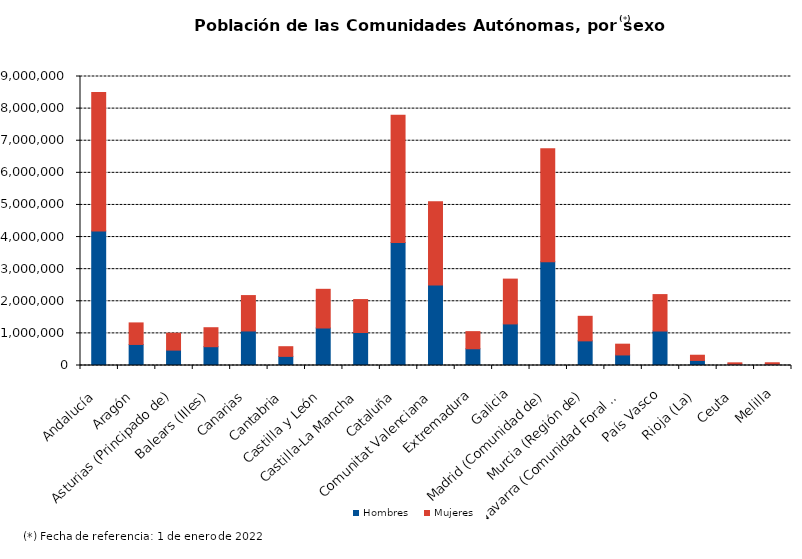
| Category | Hombres | Mujeres |
|---|---|---|
| Andalucía | 4187595 | 4312592 |
| Aragón | 655476 | 670839 |
| Asturias (Principado de) | 479134 | 525552 |
| Balears (IIles) | 585696 | 590963 |
| Canarias | 1075415 | 1102286 |
| Cantabria | 283718 | 301684 |
| Castilla y León | 1167883 | 1204757 |
| Castilla-La Mancha | 1028003 | 1025325 |
| Cataluña | 3833786 | 3958825 |
| Comunitat Valenciana | 2509961 | 2588006 |
| Extremadura | 521463 | 533313 |
| Galicia | 1294708 | 1395756 |
| Madrid (Comunidad de) | 3230154 | 3520182 |
| Murcia (Región de) | 767408 | 764470 |
| Navarra (Comunidad Foral de) | 328620 | 335497 |
| País Vasco | 1073593 | 1134581 |
| Rioja (La) | 157851 | 162041 |
| Ceuta | 41927 | 41190 |
| Melilla | 42990 | 42180 |